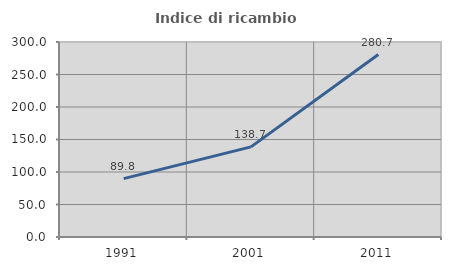
| Category | Indice di ricambio occupazionale  |
|---|---|
| 1991.0 | 89.8 |
| 2001.0 | 138.69 |
| 2011.0 | 280.687 |